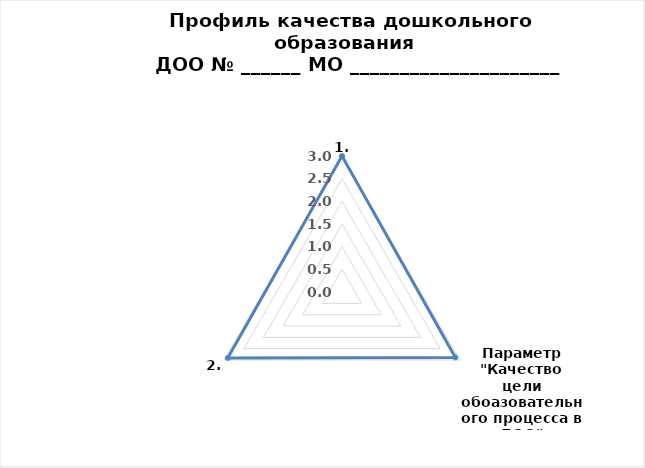
| Category | Оценка  в баллах |
|---|---|
| 0 | 3 |
| 1 | 2.888 |
| 2 | 2.909 |